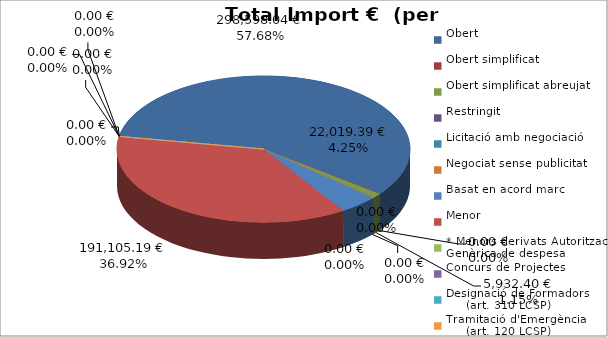
| Category | Total preu
(amb IVA) |
|---|---|
| Obert | 298598.04 |
| Obert simplificat | 0 |
| Obert simplificat abreujat | 5932.4 |
| Restringit | 0 |
| Licitació amb negociació | 0 |
| Negociat sense publicitat | 0 |
| Basat en acord marc | 22019.39 |
| Menor | 191105.19 |
| * Menors derivats Autorització Genèrica de despesa | 0 |
| Concurs de Projectes | 0 |
| Designació de Formadors
     (art. 310 LCSP) | 0 |
| Tramitació d'Emergència
     (art. 120 LCSP) | 0 |